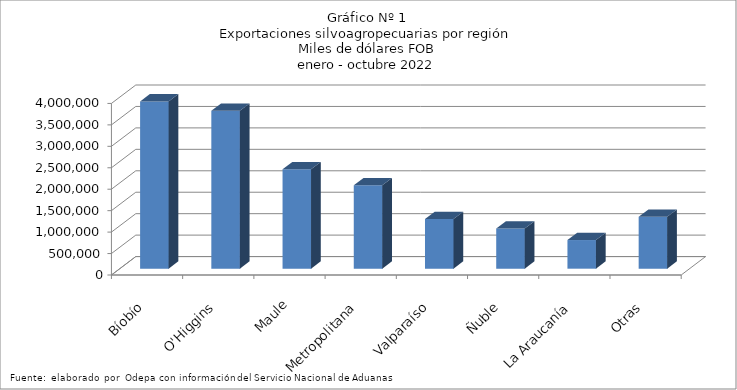
| Category | Series 0 |
|---|---|
| Bíobío | 3900536.998 |
| O'Higgins | 3680074.971 |
| Maule | 2317956.339 |
| Metropolitana | 1942823.868 |
| Valparaíso | 1155922.011 |
| Ñuble | 934145.856 |
| La Araucanía | 667933.428 |
| Otras | 1208855.655 |